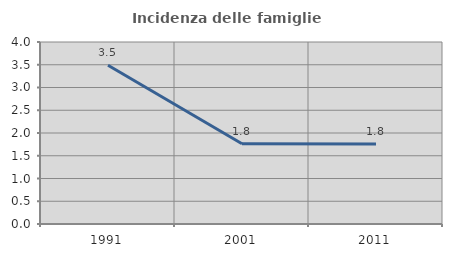
| Category | Incidenza delle famiglie numerose |
|---|---|
| 1991.0 | 3.488 |
| 2001.0 | 1.763 |
| 2011.0 | 1.758 |